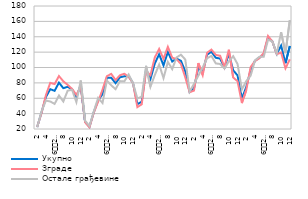
| Category | Укупно | Зграде | Остале грађевине |
|---|---|---|---|
| 2 | 22.559 | 22.725 | 22.237 |
| 3 | 41.535 | 40.825 | 42.913 |
| 4 | 61.572 | 63.952 | 56.957 |
| 5 | 71.79 | 80.04 | 55.787 |
| 6
2015. | 69.667 | 78.431 | 52.666 |
| 7 | 80.283 | 88.889 | 63.589 |
| 8 | 73.117 | 82.051 | 55.787 |
| 9 | 74.842 | 77.426 | 69.831 |
| 10 | 71.79 | 72.197 | 71.001 |
| 11 | 61.307 | 64.555 | 55.007 |
| 12 | 77.629 | 74.811 | 83.095 |
| 1
2016. | 29.459 | 28.758 | 30.819 |
| 2
 | 22.692 | 22.122 | 23.797 |
| 3 | 41.933 | 41.428 | 42.913 |
| 4 | 57.326 | 55.706 | 60.468 |
| 5 | 65.288 | 71.192 | 53.836 |
| 6
2016. | 86.785 | 88.688 | 83.095 |
| 7 | 86.653 | 91.704 | 76.853 |
| 8 | 79.62 | 83.66 | 71.782 |
| 9 | 87.316 | 89.894 | 82.315 |
| 10 | 88.51 | 91.905 | 81.925 |
| 11 | 88.909 | 87.883 | 90.897 |
| 12 | 79.62 | 79.638 | 79.584 |
| 1
2017. | 52.284 | 48.467 | 59.688 |
| 2 | 55.468 | 52.086 | 62.029 |
| 3 | 97.799 | 95.525 | 102.211 |
| 4 | 84.928 | 90.096 | 74.902 |
| 5 | 105.231 | 113.022 | 90.117 |
| 6
2017. | 117.174 | 124.082 | 103.771 |
| 7 | 102.709 | 111.212 | 86.216 |
| 8 | 120.226 | 126.898 | 107.282 |
| 9 | 107.752 | 112.821 | 97.919 |
| 10 | 111.6 | 110.809 | 113.134 |
| 11 | 108.681 | 104.575 | 116.645 |
| 12 | 95.013 | 87.079 | 110.403 |
| 1
2018. | 68.075 | 67.773 | 68.661 |
| 2
 | 72.985 | 69.985 | 78.804 |
| 3 | 100.188 | 105.782 | 89.337 |
| 4 | 93.553 | 90.096 | 100.26 |
| 5 | 116.643 | 119.055 | 111.964 |
| 6
2018. | 120.491 | 123.278 | 115.085 |
| 7 | 112.662 | 116.44 | 105.332 |
| 8 | 111.6 | 115.234 | 104.551 |
| 9 | 99.79 | 100.352 | 98.7 |
| 10 | 117.97 | 123.077 | 108.062 |
| 11 | 96.34 | 86.878 | 114.694 |
| 12 | 89.705 | 82.051 | 104.551 |
| 1
2019. | 59.715 | 53.695 | 71.391 |
| 2
 | 74.577 | 70.588 | 82.315 |
| 3 | 96.738 | 100.553 | 89.337 |
| 4 | 108.681 | 108.396 | 109.233 |
| 5 | 112.662 | 112.016 | 113.914 |
| 6
2019. | 117.174 | 118.854 | 113.914 |
| 7 | 139.3 | 141 | 136.2 |
| 8 | 133.8 | 133.7 | 133.8 |
| 9 | 117.6 | 117.2 | 118.2 |
| 10 | 128.453 | 119.457 | 145.904 |
| 11 | 105.629 | 98.944 | 118.596 |
| 12 | 127.922 | 110.608 | 161.508 |